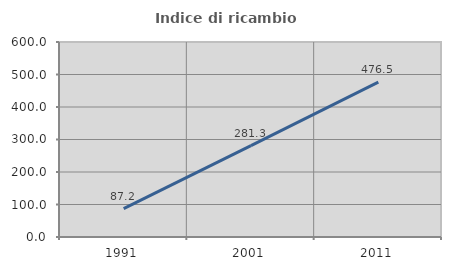
| Category | Indice di ricambio occupazionale  |
|---|---|
| 1991.0 | 87.179 |
| 2001.0 | 281.25 |
| 2011.0 | 476.471 |